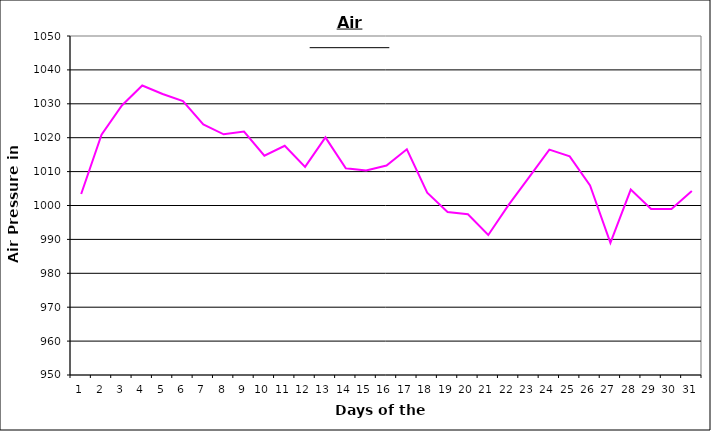
| Category | Series 0 |
|---|---|
| 0 | 1003.4 |
| 1 | 1020.9 |
| 2 | 1029.5 |
| 3 | 1035.4 |
| 4 | 1032.9 |
| 5 | 1030.8 |
| 6 | 1023.9 |
| 7 | 1021 |
| 8 | 1021.8 |
| 9 | 1014.7 |
| 10 | 1017.6 |
| 11 | 1011.4 |
| 12 | 1020.1 |
| 13 | 1011 |
| 14 | 1010.3 |
| 15 | 1011.8 |
| 16 | 1016.6 |
| 17 | 1003.8 |
| 18 | 998.1 |
| 19 | 997.4 |
| 20 | 991.3 |
| 21 | 1000.2 |
| 22 | 1008.3 |
| 23 | 1016.5 |
| 24 | 1014.5 |
| 25 | 1005.9 |
| 26 | 989 |
| 27 | 1004.7 |
| 28 | 999 |
| 29 | 999 |
| 30 | 1004.3 |